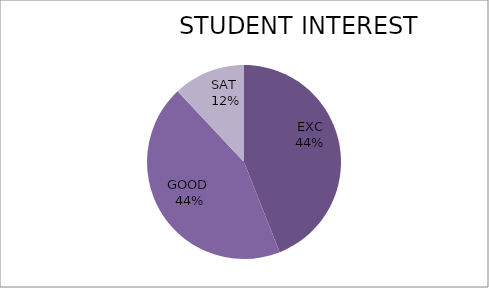
| Category | Series 0 |
|---|---|
| EXC | 44 |
| GOOD  | 44 |
| SAT  | 12 |